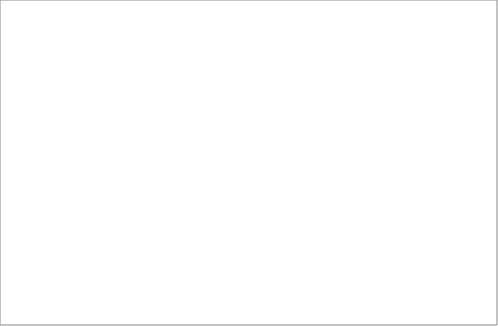
| Category | 2004 | 2005 | 2006 | 2008 | 2009 | 2010 | 2011 | 2012 | 2013 |
|---|---|---|---|---|---|---|---|---|---|
| dolnośląskie |  |  | 2 | 5 | 2 |  | 1 | 2 |  |